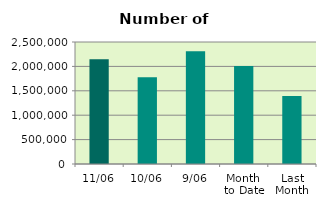
| Category | Series 0 |
|---|---|
| 11/06 | 2148450 |
| 10/06 | 1776690 |
| 9/06 | 2309812 |
| Month 
to Date | 2008087.778 |
| Last
Month | 1395416 |